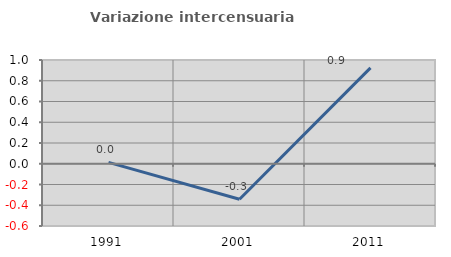
| Category | Variazione intercensuaria annua |
|---|---|
| 1991.0 | 0.014 |
| 2001.0 | -0.343 |
| 2011.0 | 0.924 |